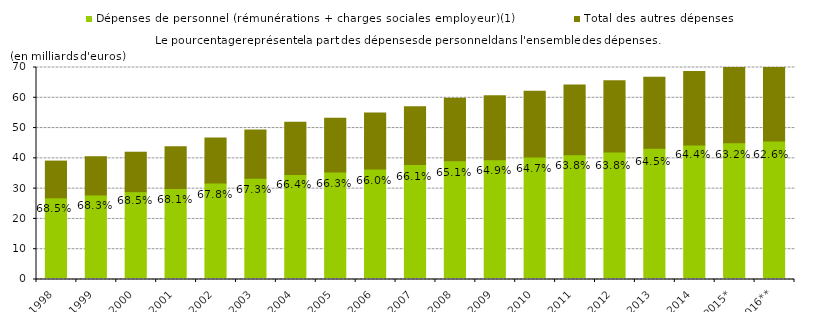
| Category | % | Dépenses de personnel (rémunérations + charges sociales employeur)(1) | Total des autres dépenses |
|---|---|---|---|
| 1998 | 0.685 | 26.3 | 12.113 |
| 1999 | 0.683 | 27.23 | 12.628 |
| 2000 | 0.685 | 28.318 | 13.027 |
| 2001 | 0.681 | 29.399 | 13.793 |
| 2002 | 0.678 | 31.211 | 14.855 |
| 2003 | 0.673 | 32.749 | 15.935 |
| 2004 | 0.664 | 34.005 | 17.227 |
| 2005 | 0.663 | 34.84 | 17.73 |
| 2006 | 0.66 | 35.851 | 18.457 |
| 2007 | 0.661 | 37.281 | 19.138 |
| 2008 | 0.651 | 38.546 | 20.669 |
| 2009 | 0.649 | 38.93 | 21.08 |
| 2010 | 0.647 | 39.831 | 21.704 |
| 2011 | 0.638 | 40.593 | 23.001 |
| 2012 | 0.638 | 41.459 | 23.528 |
| 2013 | 0.645 | 42.653 | 23.522 |
| 2014 | 0.644 | 43.799 | 24.239 |
| 2015* | 0.632 | 44.541 | 25.942 |
| 2016** | 0.626 | 45.113 | 26.92 |